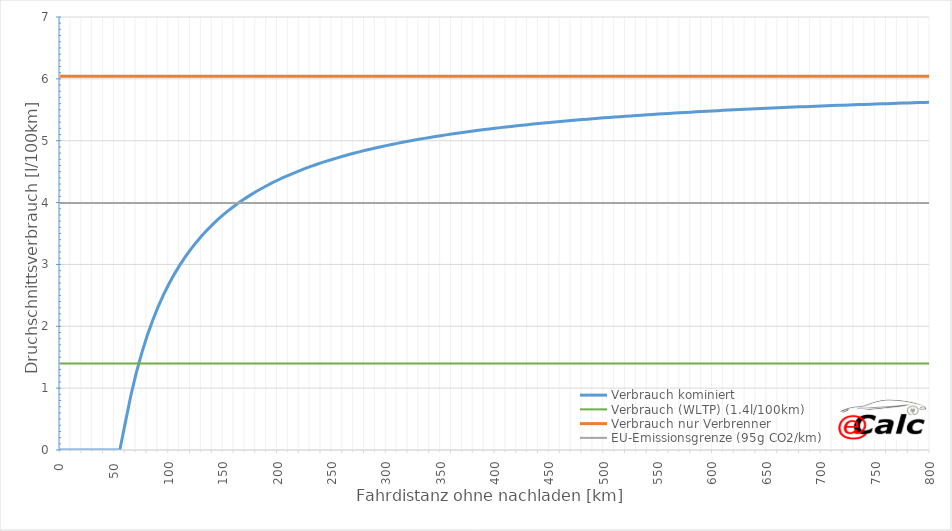
| Category | Verbrauch kominiert | Verbrauch (WLTP) (1.4l/100km) | Verbrauch nur Verbrenner | EU-Emissionsgrenze (95g CO2/km) |
|---|---|---|---|---|
| 0.0 | 0 | 1.4 | 6.042 | 3.992 |
| 5.0 | 0 | 1.4 | 6.042 | 3.992 |
| 10.0 | 0 | 1.4 | 6.042 | 3.992 |
| 15.0 | 0 | 1.4 | 6.042 | 3.992 |
| 20.0 | 0 | 1.4 | 6.042 | 3.992 |
| 25.0 | 0 | 1.4 | 6.042 | 3.992 |
| 30.0 | 0 | 1.4 | 6.042 | 3.992 |
| 35.0 | 0 | 1.4 | 6.042 | 3.992 |
| 40.0 | 0 | 1.4 | 6.042 | 3.992 |
| 45.0 | 0 | 1.4 | 6.042 | 3.992 |
| 50.0 | 0 | 1.4 | 6.042 | 3.992 |
| 55.0 | 0 | 1.4 | 6.042 | 3.992 |
| 60.0 | 0.438 | 1.4 | 6.042 | 3.992 |
| 65.0 | 0.869 | 1.4 | 6.042 | 3.992 |
| 70.0 | 1.238 | 1.4 | 6.042 | 3.992 |
| 75.0 | 1.559 | 1.4 | 6.042 | 3.992 |
| 80.0 | 1.839 | 1.4 | 6.042 | 3.992 |
| 85.0 | 2.086 | 1.4 | 6.042 | 3.992 |
| 90.0 | 2.306 | 1.4 | 6.042 | 3.992 |
| 95.0 | 2.502 | 1.4 | 6.042 | 3.992 |
| 100.0 | 2.679 | 1.4 | 6.042 | 3.992 |
| 105.0 | 2.84 | 1.4 | 6.042 | 3.992 |
| 110.0 | 2.985 | 1.4 | 6.042 | 3.992 |
| 115.0 | 3.118 | 1.4 | 6.042 | 3.992 |
| 120.0 | 3.24 | 1.4 | 6.042 | 3.992 |
| 125.0 | 3.352 | 1.4 | 6.042 | 3.992 |
| 130.0 | 3.455 | 1.4 | 6.042 | 3.992 |
| 135.0 | 3.551 | 1.4 | 6.042 | 3.992 |
| 140.0 | 3.64 | 1.4 | 6.042 | 3.992 |
| 145.0 | 3.723 | 1.4 | 6.042 | 3.992 |
| 150.0 | 3.8 | 1.4 | 6.042 | 3.992 |
| 155.0 | 3.873 | 1.4 | 6.042 | 3.992 |
| 160.0 | 3.94 | 1.4 | 6.042 | 3.992 |
| 165.0 | 4.004 | 1.4 | 6.042 | 3.992 |
| 170.0 | 4.064 | 1.4 | 6.042 | 3.992 |
| 175.0 | 4.12 | 1.4 | 6.042 | 3.992 |
| 180.0 | 4.174 | 1.4 | 6.042 | 3.992 |
| 185.0 | 4.224 | 1.4 | 6.042 | 3.992 |
| 190.0 | 4.272 | 1.4 | 6.042 | 3.992 |
| 195.0 | 4.318 | 1.4 | 6.042 | 3.992 |
| 200.0 | 4.361 | 1.4 | 6.042 | 3.992 |
| 205.0 | 4.402 | 1.4 | 6.042 | 3.992 |
| 210.0 | 4.441 | 1.4 | 6.042 | 3.992 |
| 215.0 | 4.478 | 1.4 | 6.042 | 3.992 |
| 220.0 | 4.513 | 1.4 | 6.042 | 3.992 |
| 225.0 | 4.547 | 1.4 | 6.042 | 3.992 |
| 230.0 | 4.58 | 1.4 | 6.042 | 3.992 |
| 235.0 | 4.611 | 1.4 | 6.042 | 3.992 |
| 240.0 | 4.641 | 1.4 | 6.042 | 3.992 |
| 245.0 | 4.669 | 1.4 | 6.042 | 3.992 |
| 250.0 | 4.697 | 1.4 | 6.042 | 3.992 |
| 255.0 | 4.723 | 1.4 | 6.042 | 3.992 |
| 260.0 | 4.749 | 1.4 | 6.042 | 3.992 |
| 265.0 | 4.773 | 1.4 | 6.042 | 3.992 |
| 270.0 | 4.796 | 1.4 | 6.042 | 3.992 |
| 275.0 | 4.819 | 1.4 | 6.042 | 3.992 |
| 280.0 | 4.841 | 1.4 | 6.042 | 3.992 |
| 285.0 | 4.862 | 1.4 | 6.042 | 3.992 |
| 290.0 | 4.882 | 1.4 | 6.042 | 3.992 |
| 295.0 | 4.902 | 1.4 | 6.042 | 3.992 |
| 300.0 | 4.921 | 1.4 | 6.042 | 3.992 |
| 305.0 | 4.939 | 1.4 | 6.042 | 3.992 |
| 310.0 | 4.957 | 1.4 | 6.042 | 3.992 |
| 315.0 | 4.974 | 1.4 | 6.042 | 3.992 |
| 320.0 | 4.991 | 1.4 | 6.042 | 3.992 |
| 325.0 | 5.007 | 1.4 | 6.042 | 3.992 |
| 330.0 | 5.023 | 1.4 | 6.042 | 3.992 |
| 335.0 | 5.038 | 1.4 | 6.042 | 3.992 |
| 340.0 | 5.053 | 1.4 | 6.042 | 3.992 |
| 345.0 | 5.067 | 1.4 | 6.042 | 3.992 |
| 350.0 | 5.081 | 1.4 | 6.042 | 3.992 |
| 355.0 | 5.095 | 1.4 | 6.042 | 3.992 |
| 360.0 | 5.108 | 1.4 | 6.042 | 3.992 |
| 365.0 | 5.121 | 1.4 | 6.042 | 3.992 |
| 370.0 | 5.133 | 1.4 | 6.042 | 3.992 |
| 375.0 | 5.145 | 1.4 | 6.042 | 3.992 |
| 380.0 | 5.157 | 1.4 | 6.042 | 3.992 |
| 385.0 | 5.168 | 1.4 | 6.042 | 3.992 |
| 390.0 | 5.18 | 1.4 | 6.042 | 3.992 |
| 395.0 | 5.191 | 1.4 | 6.042 | 3.992 |
| 400.0 | 5.201 | 1.4 | 6.042 | 3.992 |
| 405.0 | 5.212 | 1.4 | 6.042 | 3.992 |
| 410.0 | 5.222 | 1.4 | 6.042 | 3.992 |
| 415.0 | 5.232 | 1.4 | 6.042 | 3.992 |
| 420.0 | 5.241 | 1.4 | 6.042 | 3.992 |
| 425.0 | 5.251 | 1.4 | 6.042 | 3.992 |
| 430.0 | 5.26 | 1.4 | 6.042 | 3.992 |
| 435.0 | 5.269 | 1.4 | 6.042 | 3.992 |
| 440.0 | 5.278 | 1.4 | 6.042 | 3.992 |
| 445.0 | 5.286 | 1.4 | 6.042 | 3.992 |
| 450.0 | 5.295 | 1.4 | 6.042 | 3.992 |
| 455.0 | 5.303 | 1.4 | 6.042 | 3.992 |
| 460.0 | 5.311 | 1.4 | 6.042 | 3.992 |
| 465.0 | 5.319 | 1.4 | 6.042 | 3.992 |
| 470.0 | 5.326 | 1.4 | 6.042 | 3.992 |
| 475.0 | 5.334 | 1.4 | 6.042 | 3.992 |
| 480.0 | 5.341 | 1.4 | 6.042 | 3.992 |
| 485.0 | 5.349 | 1.4 | 6.042 | 3.992 |
| 490.0 | 5.356 | 1.4 | 6.042 | 3.992 |
| 495.0 | 5.363 | 1.4 | 6.042 | 3.992 |
| 500.0 | 5.369 | 1.4 | 6.042 | 3.992 |
| 505.0 | 5.376 | 1.4 | 6.042 | 3.992 |
| 510.0 | 5.383 | 1.4 | 6.042 | 3.992 |
| 515.0 | 5.389 | 1.4 | 6.042 | 3.992 |
| 520.0 | 5.395 | 1.4 | 6.042 | 3.992 |
| 525.0 | 5.401 | 1.4 | 6.042 | 3.992 |
| 530.0 | 5.407 | 1.4 | 6.042 | 3.992 |
| 535.0 | 5.413 | 1.4 | 6.042 | 3.992 |
| 540.0 | 5.419 | 1.4 | 6.042 | 3.992 |
| 545.0 | 5.425 | 1.4 | 6.042 | 3.992 |
| 550.0 | 5.43 | 1.4 | 6.042 | 3.992 |
| 555.0 | 5.436 | 1.4 | 6.042 | 3.992 |
| 560.0 | 5.441 | 1.4 | 6.042 | 3.992 |
| 565.0 | 5.447 | 1.4 | 6.042 | 3.992 |
| 570.0 | 5.452 | 1.4 | 6.042 | 3.992 |
| 575.0 | 5.457 | 1.4 | 6.042 | 3.992 |
| 580.0 | 5.462 | 1.4 | 6.042 | 3.992 |
| 585.0 | 5.467 | 1.4 | 6.042 | 3.992 |
| 590.0 | 5.472 | 1.4 | 6.042 | 3.992 |
| 595.0 | 5.477 | 1.4 | 6.042 | 3.992 |
| 600.0 | 5.481 | 1.4 | 6.042 | 3.992 |
| 605.0 | 5.486 | 1.4 | 6.042 | 3.992 |
| 610.0 | 5.491 | 1.4 | 6.042 | 3.992 |
| 615.0 | 5.495 | 1.4 | 6.042 | 3.992 |
| 620.0 | 5.5 | 1.4 | 6.042 | 3.992 |
| 625.0 | 5.504 | 1.4 | 6.042 | 3.992 |
| 630.0 | 5.508 | 1.4 | 6.042 | 3.992 |
| 635.0 | 5.512 | 1.4 | 6.042 | 3.992 |
| 640.0 | 5.516 | 1.4 | 6.042 | 3.992 |
| 645.0 | 5.521 | 1.4 | 6.042 | 3.992 |
| 650.0 | 5.525 | 1.4 | 6.042 | 3.992 |
| 655.0 | 5.528 | 1.4 | 6.042 | 3.992 |
| 660.0 | 5.532 | 1.4 | 6.042 | 3.992 |
| 665.0 | 5.536 | 1.4 | 6.042 | 3.992 |
| 670.0 | 5.54 | 1.4 | 6.042 | 3.992 |
| 675.0 | 5.544 | 1.4 | 6.042 | 3.992 |
| 680.0 | 5.547 | 1.4 | 6.042 | 3.992 |
| 685.0 | 5.551 | 1.4 | 6.042 | 3.992 |
| 690.0 | 5.555 | 1.4 | 6.042 | 3.992 |
| 695.0 | 5.558 | 1.4 | 6.042 | 3.992 |
| 700.0 | 5.561 | 1.4 | 6.042 | 3.992 |
| 705.0 | 5.565 | 1.4 | 6.042 | 3.992 |
| 710.0 | 5.568 | 1.4 | 6.042 | 3.992 |
| 715.0 | 5.572 | 1.4 | 6.042 | 3.992 |
| 720.0 | 5.575 | 1.4 | 6.042 | 3.992 |
| 725.0 | 5.578 | 1.4 | 6.042 | 3.992 |
| 730.0 | 5.581 | 1.4 | 6.042 | 3.992 |
| 735.0 | 5.584 | 1.4 | 6.042 | 3.992 |
| 740.0 | 5.587 | 1.4 | 6.042 | 3.992 |
| 745.0 | 5.59 | 1.4 | 6.042 | 3.992 |
| 750.0 | 5.594 | 1.4 | 6.042 | 3.992 |
| 755.0 | 5.596 | 1.4 | 6.042 | 3.992 |
| 760.0 | 5.599 | 1.4 | 6.042 | 3.992 |
| 765.0 | 5.602 | 1.4 | 6.042 | 3.992 |
| 770.0 | 5.605 | 1.4 | 6.042 | 3.992 |
| 775.0 | 5.608 | 1.4 | 6.042 | 3.992 |
| 780.0 | 5.611 | 1.4 | 6.042 | 3.992 |
| 785.0 | 5.613 | 1.4 | 6.042 | 3.992 |
| 790.0 | 5.616 | 1.4 | 6.042 | 3.992 |
| 795.0 | 5.619 | 1.4 | 6.042 | 3.992 |
| 800.0 | 5.622 | 1.4 | 6.042 | 3.992 |